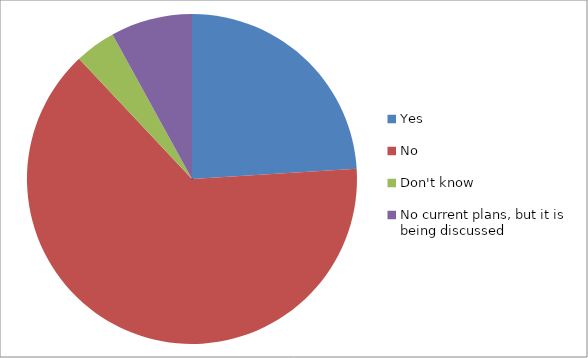
| Category | Series 0 |
|---|---|
| Yes | 6 |
| No | 16 |
| Don't know | 1 |
| No current plans, but it is being discussed | 2 |